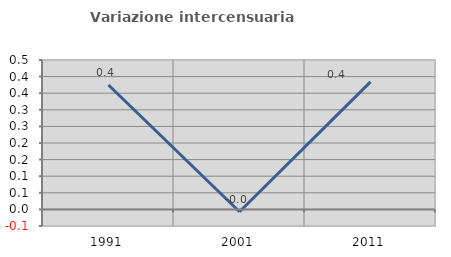
| Category | Variazione intercensuaria annua |
|---|---|
| 1991.0 | 0.375 |
| 2001.0 | -0.007 |
| 2011.0 | 0.384 |